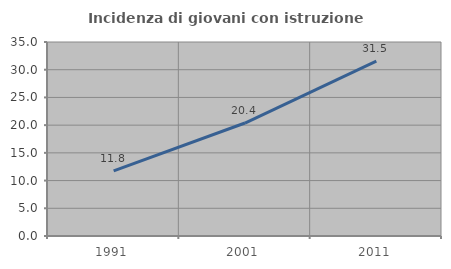
| Category | Incidenza di giovani con istruzione universitaria |
|---|---|
| 1991.0 | 11.755 |
| 2001.0 | 20.38 |
| 2011.0 | 31.537 |